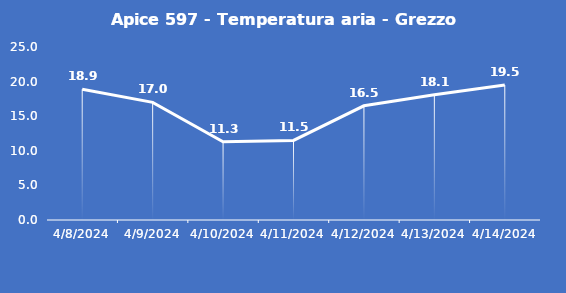
| Category | Apice 597 - Temperatura aria - Grezzo (°C) |
|---|---|
| 4/8/24 | 18.9 |
| 4/9/24 | 17 |
| 4/10/24 | 11.3 |
| 4/11/24 | 11.5 |
| 4/12/24 | 16.5 |
| 4/13/24 | 18.1 |
| 4/14/24 | 19.5 |